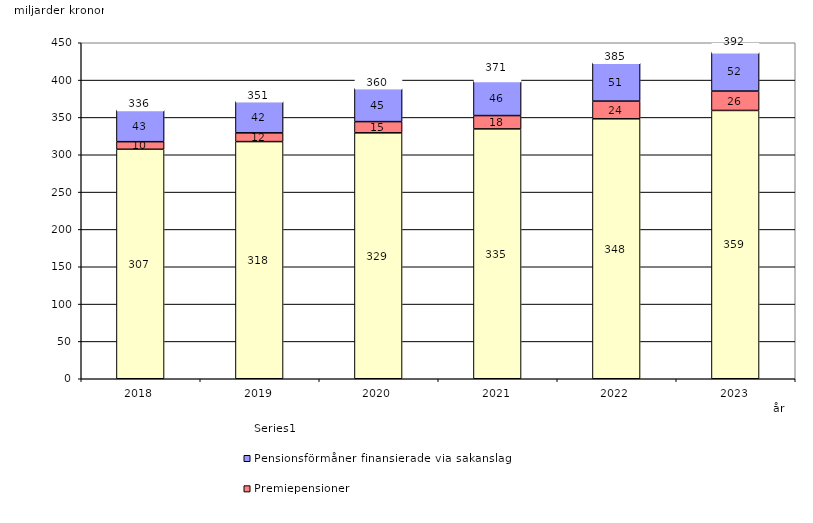
| Category | Inkomstpension och tilläggspension m.m. | Premiepensioner | Pensionsförmåner finansierade via sakanslag | Series 0 |
|---|---|---|---|---|
| 2018.0 | 307.356 | 10.141 | 42.55 | 20 |
| 2019.0 | 317.628 | 11.715 | 42.22 | 20 |
| 2020.0 | 329.365 | 15.016 | 44.546 | 20 |
| 2021.0 | 334.629 | 17.837 | 46.326 | 20 |
| 2022.0 | 348.18 | 23.669 | 51.21 | 20 |
| 2023.0 | 359.336 | 25.953 | 52.094 | 20 |